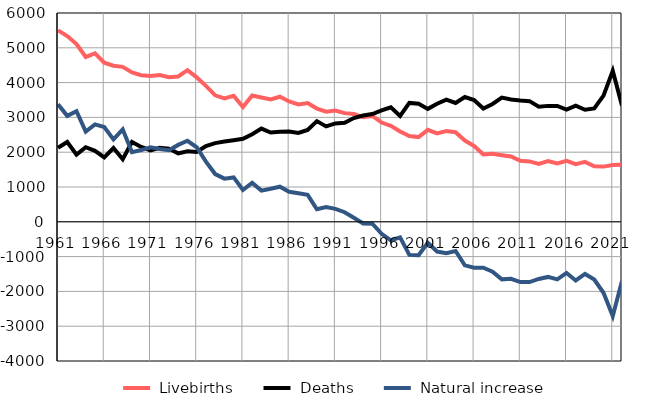
| Category |  Livebirths |  Deaths |  Natural increase |
|---|---|---|---|
| 1961.0 | 5502 | 2125 | 3377 |
| 1962.0 | 5336 | 2292 | 3044 |
| 1963.0 | 5108 | 1929 | 3179 |
| 1964.0 | 4736 | 2143 | 2593 |
| 1965.0 | 4839 | 2039 | 2800 |
| 1966.0 | 4571 | 1848 | 2723 |
| 1967.0 | 4486 | 2118 | 2368 |
| 1968.0 | 4452 | 1799 | 2653 |
| 1969.0 | 4292 | 2294 | 1998 |
| 1970.0 | 4214 | 2152 | 2062 |
| 1971.0 | 4192 | 2050 | 2142 |
| 1972.0 | 4217 | 2125 | 2092 |
| 1973.0 | 4154 | 2097 | 2057 |
| 1974.0 | 4177 | 1967 | 2210 |
| 1975.0 | 4356 | 2028 | 2328 |
| 1976.0 | 4150 | 2008 | 2142 |
| 1977.0 | 3906 | 2178 | 1728 |
| 1978.0 | 3634 | 2262 | 1372 |
| 1979.0 | 3545 | 2305 | 1240 |
| 1980.0 | 3621 | 2346 | 1275 |
| 1981.0 | 3298 | 2385 | 913 |
| 1982.0 | 3631 | 2514 | 1117 |
| 1983.0 | 3574 | 2678 | 896 |
| 1984.0 | 3516 | 2565 | 951 |
| 1985.0 | 3594 | 2586 | 1008 |
| 1986.0 | 3458 | 2596 | 862 |
| 1987.0 | 3373 | 2554 | 819 |
| 1988.0 | 3413 | 2640 | 773 |
| 1989.0 | 3254 | 2893 | 361 |
| 1990.0 | 3164 | 2742 | 422 |
| 1991.0 | 3199 | 2828 | 371 |
| 1992.0 | 3123 | 2848 | 275 |
| 1993.0 | 3097 | 2982 | 115 |
| 1994.0 | 3006 | 3054 | -48 |
| 1995.0 | 3042 | 3096 | -54 |
| 1996.0 | 2853 | 3199 | -346 |
| 1997.0 | 2758 | 3289 | -531 |
| 1998.0 | 2596 | 3042 | -446 |
| 1999.0 | 2464 | 3415 | -951 |
| 2000.0 | 2435 | 3394 | -959 |
| 2001.0 | 2641 | 3245 | -604 |
| 2002.0 | 2538 | 3392 | -854 |
| 2003.0 | 2609 | 3510 | -901 |
| 2004.0 | 2574 | 3414 | -840 |
| 2005.0 | 2334 | 3585 | -1251 |
| 2006.0 | 2180 | 3498 | -1318 |
| 2007.0 | 1935 | 3256 | -1321 |
| 2008.0 | 1953 | 3387 | -1434 |
| 2009.0 | 1914 | 3568 | -1654 |
| 2010.0 | 1878 | 3516 | -1638 |
| 2011.0 | 1751 | 3483 | -1732 |
| 2012.0 | 1735 | 3467 | -1732 |
| 2013.0 | 1664 | 3307 | -1643 |
| 2014.0 | 1747 | 3331 | -1584 |
| 2015.0 | 1676 | 3329 | -1653 |
| 2016.0 | 1754 | 3222 | -1468 |
| 2017.0 | 1655 | 3340 | -1685 |
| 2018.0 | 1722 | 3220 | -1498 |
| 2019.0 | 1598 | 3256 | -1658 |
| 2020.0 | 1586 | 3626 | -2040 |
| 2021.0 | 1632 | 4341 | -2709 |
| 2022.0 | 1637 | 3336 | -1699 |